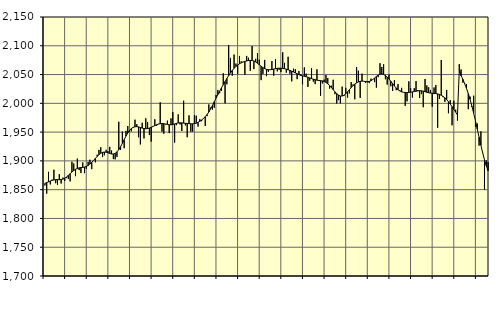
| Category | Piggar | Series 1 |
|---|---|---|
| nan | 1857.3 | 1860.96 |
| 1.0 | 1843.2 | 1862.29 |
| 1.0 | 1881 | 1863.7 |
| 1.0 | 1859.1 | 1865.03 |
| 1.0 | 1867.5 | 1866.13 |
| 1.0 | 1884.7 | 1866.98 |
| 1.0 | 1861.2 | 1867.26 |
| 1.0 | 1858.3 | 1867.4 |
| 1.0 | 1877.1 | 1867.34 |
| 1.0 | 1860.7 | 1867.57 |
| 1.0 | 1870.9 | 1868.35 |
| 1.0 | 1865 | 1869.82 |
| nan | 1870.1 | 1872.03 |
| 2.0 | 1868.7 | 1874.79 |
| 2.0 | 1864.4 | 1877.77 |
| 2.0 | 1898.5 | 1880.65 |
| 2.0 | 1895.5 | 1883.26 |
| 2.0 | 1873.5 | 1885.37 |
| 2.0 | 1903.9 | 1886.89 |
| 2.0 | 1884 | 1887.89 |
| 2.0 | 1878.9 | 1888.43 |
| 2.0 | 1897.3 | 1888.78 |
| 2.0 | 1878.7 | 1889.36 |
| 2.0 | 1886.3 | 1890.42 |
| nan | 1898.3 | 1892.15 |
| 3.0 | 1902 | 1894.54 |
| 3.0 | 1885.7 | 1897.49 |
| 3.0 | 1900.4 | 1900.83 |
| 3.0 | 1897.5 | 1904.29 |
| 3.0 | 1910.7 | 1907.7 |
| 3.0 | 1919.1 | 1910.79 |
| 3.0 | 1923.7 | 1913.23 |
| 3.0 | 1906.6 | 1914.75 |
| 3.0 | 1909.7 | 1915.34 |
| 3.0 | 1919.3 | 1915.04 |
| 3.0 | 1916.9 | 1914.11 |
| nan | 1924.4 | 1912.94 |
| 4.0 | 1917.9 | 1912.05 |
| 4.0 | 1903.1 | 1912 |
| 4.0 | 1902.7 | 1913.14 |
| 4.0 | 1907 | 1915.61 |
| 4.0 | 1968 | 1919.5 |
| 4.0 | 1919.1 | 1924.59 |
| 4.0 | 1950.9 | 1930.48 |
| 4.0 | 1922 | 1936.82 |
| 4.0 | 1952.2 | 1943.05 |
| 4.0 | 1960.6 | 1948.55 |
| 4.0 | 1950.2 | 1952.96 |
| nan | 1951.4 | 1956.22 |
| 5.0 | 1957.6 | 1958.31 |
| 5.0 | 1971.6 | 1959.31 |
| 5.0 | 1963.9 | 1959.47 |
| 5.0 | 1941 | 1959.03 |
| 5.0 | 1928.6 | 1958.08 |
| 5.0 | 1966.2 | 1957 |
| 5.0 | 1939 | 1956.19 |
| 5.0 | 1973.9 | 1955.86 |
| 5.0 | 1967.5 | 1956.17 |
| 5.0 | 1944.9 | 1957.04 |
| 5.0 | 1933.6 | 1958.33 |
| nan | 1959.5 | 1959.79 |
| 6.0 | 1972.3 | 1961.34 |
| 6.0 | 1960.9 | 1962.8 |
| 6.0 | 1964.3 | 1963.89 |
| 6.0 | 2001.7 | 1964.58 |
| 6.0 | 1950.9 | 1964.93 |
| 6.0 | 1947.2 | 1964.69 |
| 6.0 | 1963.3 | 1964.03 |
| 6.0 | 1969.9 | 1963.35 |
| 6.0 | 1948.2 | 1962.77 |
| 6.0 | 1973.9 | 1962.66 |
| 6.0 | 1985 | 1963.22 |
| nan | 1931.7 | 1964.2 |
| 7.0 | 1962.1 | 1965.14 |
| 7.0 | 1980.8 | 1965.85 |
| 7.0 | 1963.3 | 1966.19 |
| 7.0 | 1951.9 | 1966.1 |
| 7.0 | 2004.5 | 1965.67 |
| 7.0 | 1961.5 | 1965.27 |
| 7.0 | 1941.1 | 1964.96 |
| 7.0 | 1979.1 | 1964.66 |
| 7.0 | 1950.7 | 1964.42 |
| 7.0 | 1950.8 | 1964.42 |
| 7.0 | 1979.5 | 1964.75 |
| nan | 1978.5 | 1965.58 |
| 8.0 | 1959.6 | 1966.98 |
| 8.0 | 1972.5 | 1968.79 |
| 8.0 | 1969 | 1971.05 |
| 8.0 | 1974.2 | 1973.72 |
| 8.0 | 1960.7 | 1976.85 |
| 8.0 | 1977.7 | 1980.52 |
| 8.0 | 1998.1 | 1985.01 |
| 8.0 | 1992.7 | 1990.34 |
| 8.0 | 1989.2 | 1996.31 |
| 8.0 | 1992.3 | 2002.65 |
| 8.0 | 2014.6 | 2009 |
| nan | 2023.3 | 2015.2 |
| 9.0 | 2017.6 | 2021.16 |
| 9.0 | 2021.4 | 2026.9 |
| 9.0 | 2052.2 | 2032.4 |
| 9.0 | 2000 | 2037.83 |
| 9.0 | 2033.1 | 2043.13 |
| 9.0 | 2101.1 | 2048.18 |
| 9.0 | 2078.9 | 2052.91 |
| 9.0 | 2048.1 | 2057.1 |
| 9.0 | 2084.7 | 2060.83 |
| 9.0 | 2069.1 | 2064.1 |
| 9.0 | 2050.8 | 2066.76 |
| nan | 2082.3 | 2068.76 |
| 10.0 | 2073 | 2070.35 |
| 10.0 | 2072 | 2071.75 |
| 10.0 | 2049.8 | 2072.86 |
| 10.0 | 2082.4 | 2073.7 |
| 10.0 | 2079.2 | 2074.33 |
| 10.0 | 2056.6 | 2074.64 |
| 10.0 | 2099.5 | 2074.38 |
| 10.0 | 2059.5 | 2073.53 |
| 10.0 | 2077.3 | 2071.92 |
| 10.0 | 2087.1 | 2069.63 |
| 10.0 | 2075.9 | 2067.04 |
| nan | 2040.3 | 2064.45 |
| 11.0 | 2051.1 | 2062.1 |
| 11.0 | 2075.5 | 2060.23 |
| 11.0 | 2047.2 | 2059.03 |
| 11.0 | 2054.8 | 2058.43 |
| 11.0 | 2058 | 2058.32 |
| 11.0 | 2073.4 | 2058.74 |
| 11.0 | 2048 | 2059.48 |
| 11.0 | 2076.5 | 2060.2 |
| 11.0 | 2055.6 | 2060.82 |
| 11.0 | 2058.3 | 2061.09 |
| 11.0 | 2054.3 | 2060.96 |
| nan | 2088.6 | 2060.63 |
| 12.0 | 2070.3 | 2060.12 |
| 12.0 | 2053.3 | 2059.3 |
| 12.0 | 2080.9 | 2058.27 |
| 12.0 | 2051.4 | 2057.18 |
| 12.0 | 2038.2 | 2055.91 |
| 12.0 | 2060.1 | 2054.45 |
| 12.0 | 2059.3 | 2052.91 |
| 12.0 | 2042 | 2051.34 |
| 12.0 | 2056.2 | 2049.78 |
| 12.0 | 2050.6 | 2048.55 |
| 12.0 | 2033.1 | 2047.66 |
| nan | 2062.5 | 2046.99 |
| 13.0 | 2051.6 | 2046.27 |
| 13.0 | 2028.5 | 2045.34 |
| 13.0 | 2039.4 | 2044.24 |
| 13.0 | 2060.8 | 2043.06 |
| 13.0 | 2037.7 | 2041.95 |
| 13.0 | 2033.4 | 2040.99 |
| 13.0 | 2059.1 | 2040.25 |
| 13.0 | 2040.5 | 2039.75 |
| 13.0 | 2013.2 | 2039.45 |
| 13.0 | 2034.5 | 2038.94 |
| 13.0 | 2041.1 | 2038 |
| nan | 2049 | 2036.37 |
| 14.0 | 2044 | 2033.97 |
| 14.0 | 2025.6 | 2030.99 |
| 14.0 | 2030.6 | 2027.53 |
| 14.0 | 2040.9 | 2023.74 |
| 14.0 | 2015.9 | 2020.06 |
| 14.0 | 1999.8 | 2016.8 |
| 14.0 | 2005.5 | 2014.19 |
| 14.0 | 2000 | 2012.72 |
| 14.0 | 2029 | 2012.68 |
| 14.0 | 2012.6 | 2014.1 |
| 14.0 | 2026.9 | 2016.65 |
| nan | 2010 | 2019.96 |
| 15.0 | 2017.2 | 2023.63 |
| 15.0 | 2036.9 | 2027.31 |
| 15.0 | 2032.8 | 2030.66 |
| 15.0 | 2007.1 | 2033.42 |
| 15.0 | 2063.1 | 2035.59 |
| 15.0 | 2056.7 | 2037.25 |
| 15.0 | 2009.4 | 2038.29 |
| 15.0 | 2051.6 | 2038.64 |
| 15.0 | 2038.6 | 2038.38 |
| 15.0 | 2035.3 | 2037.86 |
| 15.0 | 2036.6 | 2037.64 |
| nan | 2035.2 | 2038.04 |
| 16.0 | 2042.9 | 2039.3 |
| 16.0 | 2041.3 | 2041.38 |
| 16.0 | 2036.8 | 2043.95 |
| 16.0 | 2027.4 | 2046.67 |
| 16.0 | 2045.4 | 2049.02 |
| 16.0 | 2069.7 | 2050.45 |
| 16.0 | 2063.2 | 2050.82 |
| 16.0 | 2067.9 | 2050.11 |
| 16.0 | 2041.8 | 2048.3 |
| 16.0 | 2032.5 | 2045.67 |
| 16.0 | 2049.7 | 2042.3 |
| nan | 2029.6 | 2038.36 |
| 17.0 | 2021.4 | 2034.23 |
| 17.0 | 2040.1 | 2030.24 |
| 17.0 | 2022.9 | 2026.65 |
| 17.0 | 2033.3 | 2023.69 |
| 17.0 | 2023 | 2021.5 |
| 17.0 | 2026.9 | 2019.98 |
| 17.0 | 2019.4 | 2019.14 |
| 17.0 | 1995.8 | 2018.78 |
| 17.0 | 2003.5 | 2018.74 |
| 17.0 | 2038.2 | 2018.96 |
| 17.0 | 2026.2 | 2019.33 |
| nan | 2010 | 2019.87 |
| 18.0 | 2026.3 | 2020.52 |
| 18.0 | 2038.6 | 2021.04 |
| 18.0 | 2023.2 | 2021.54 |
| 18.0 | 2009.2 | 2021.97 |
| 18.0 | 2016 | 2021.85 |
| 18.0 | 1993.3 | 2021.18 |
| 18.0 | 2042.2 | 2020.23 |
| 18.0 | 2031 | 2019.2 |
| 18.0 | 2027.8 | 2018.42 |
| 18.0 | 2023.2 | 2017.81 |
| 18.0 | 1994.1 | 2017.45 |
| nan | 2027.5 | 2017.24 |
| 19.0 | 2031.7 | 2016.97 |
| 19.0 | 1957.6 | 2016.42 |
| 19.0 | 2007.7 | 2015.43 |
| 19.0 | 2075.3 | 2013.98 |
| 19.0 | 2010.7 | 2012.07 |
| 19.0 | 2002.5 | 2009.62 |
| 19.0 | 2023.3 | 2006.54 |
| 19.0 | 1982.8 | 2002.82 |
| 19.0 | 2005.6 | 1998.66 |
| 19.0 | 1961.9 | 1994.22 |
| 19.0 | 2004.5 | 1989.52 |
| nan | 1988.9 | 1984.73 |
| 20.0 | 1970 | 1979.8 |
| 20.0 | 2068.1 | 2057.22 |
| 20.0 | 2058.9 | 2048 |
| 20.0 | 2035.9 | 2041.84 |
| 20.0 | 2035.2 | 2033.94 |
| 20.0 | 2033.3 | 2026.01 |
| 20.0 | 1989.8 | 2016.95 |
| 20.0 | 2011.7 | 2006.71 |
| 20.0 | 1993.7 | 1995.32 |
| 20.0 | 2013.3 | 1982.78 |
| 20.0 | 1958.8 | 1969.4 |
| nan | 1965 | 1955.35 |
| 21.0 | 1926.6 | 1941.1 |
| 21.0 | 1951.1 | 1927.17 |
| 21.0 | 1914.4 | 1913.95 |
| 21.0 | 1850.4 | 1901.92 |
| 21.0 | 1900.8 | 1891.43 |
| 21.0 | 1897.9 | 1882.6 |